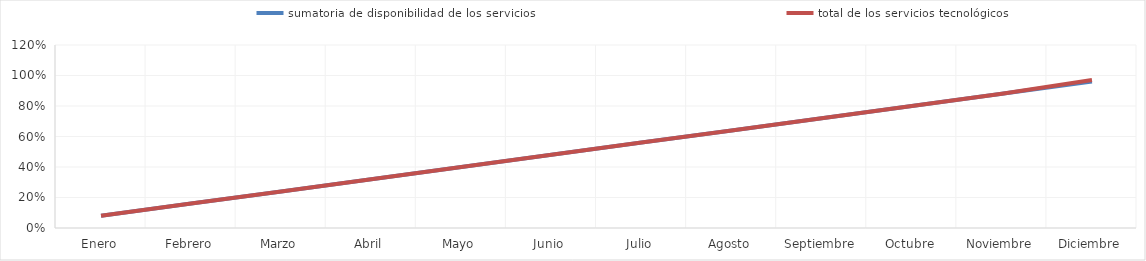
| Category | sumatoria de disponibilidad de los servicios | total de los servicios tecnológicos |
|---|---|---|
| 0 | 0.08 | 0.08 |
| 1 | 0.16 | 0.16 |
| 2 | 0.24 | 0.24 |
| 3 | 0.32 | 0.32 |
| 4 | 0.4 | 0.4 |
| 5 | 0.48 | 0.48 |
| 6 | 0.56 | 0.56 |
| 7 | 0.64 | 0.64 |
| 8 | 0.72 | 0.72 |
| 9 | 0.8 | 0.8 |
| 10 | 0.88 | 0.88 |
| 11 | 0.96 | 0.97 |